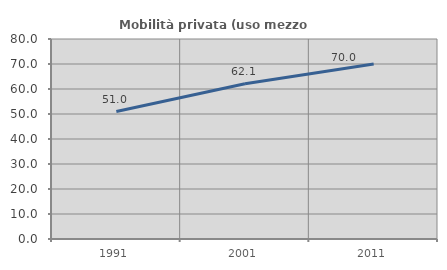
| Category | Mobilità privata (uso mezzo privato) |
|---|---|
| 1991.0 | 50.98 |
| 2001.0 | 62.121 |
| 2011.0 | 70 |